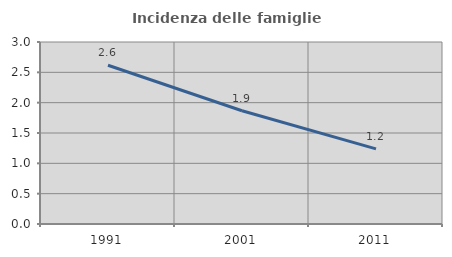
| Category | Incidenza delle famiglie numerose |
|---|---|
| 1991.0 | 2.617 |
| 2001.0 | 1.867 |
| 2011.0 | 1.238 |